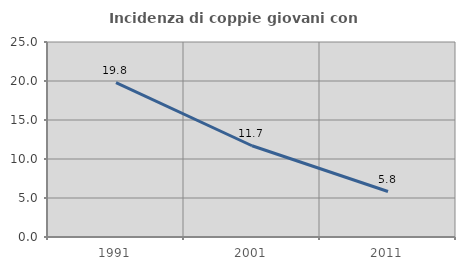
| Category | Incidenza di coppie giovani con figli |
|---|---|
| 1991.0 | 19.802 |
| 2001.0 | 11.7 |
| 2011.0 | 5.832 |